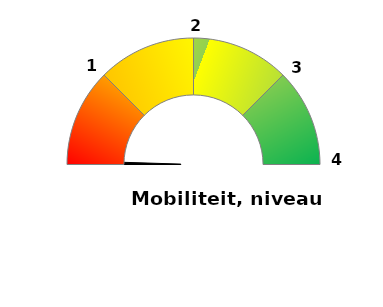
| Category | Variable | Fixe |
|---|---|---|
| 0.0 | 0 | 0 |
| 1.0 | 0.01 | 25 |
| 2.0 | 0.99 | 25 |
| 3.0 | 0 | 25 |
| 4.0 | 0 | 25 |
| 5.0 | 1 | 100 |